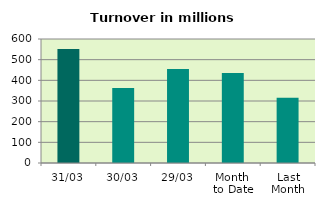
| Category | Series 0 |
|---|---|
| 31/03 | 551.527 |
| 30/03 | 362.555 |
| 29/03 | 454.929 |
| Month 
to Date | 435.216 |
| Last
Month | 316.082 |